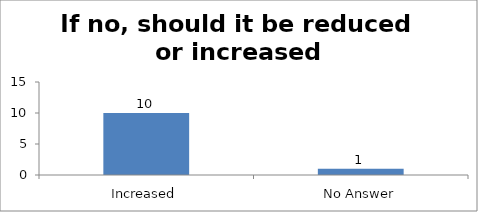
| Category | If no, should it be reduced or increased |
|---|---|
| Increased | 10 |
| No Answer | 1 |